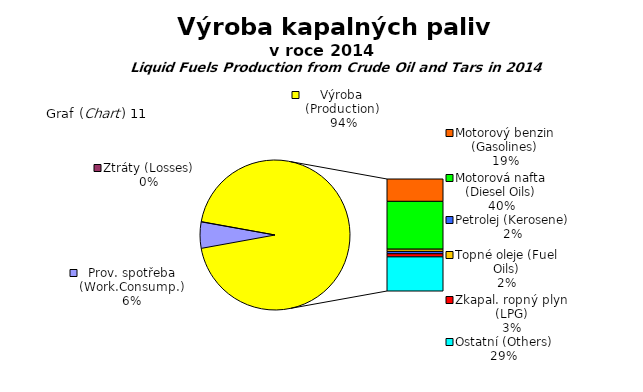
| Category | Series 0 |
|---|---|
| Prov. spotřeba (Work.Consump.) | 19687608.6 |
| Ztráty (Losses) | 199455 |
| Motorový benzin (Gasolines) | 65524104 |
| Motorová nafta (Diesel Oils) | 139994805 |
| Topné oleje (Fuel Oils) | 6537408 |
| Petrolej (Kerosene) | 6861314 |
| Zkapal. ropný plyn (LPG) | 9102147 |
| Ostatní (Others) | 99971828 |